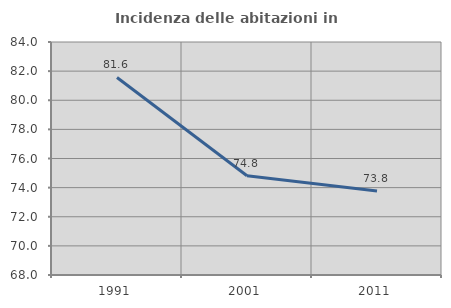
| Category | Incidenza delle abitazioni in proprietà  |
|---|---|
| 1991.0 | 81.565 |
| 2001.0 | 74.817 |
| 2011.0 | 73.764 |